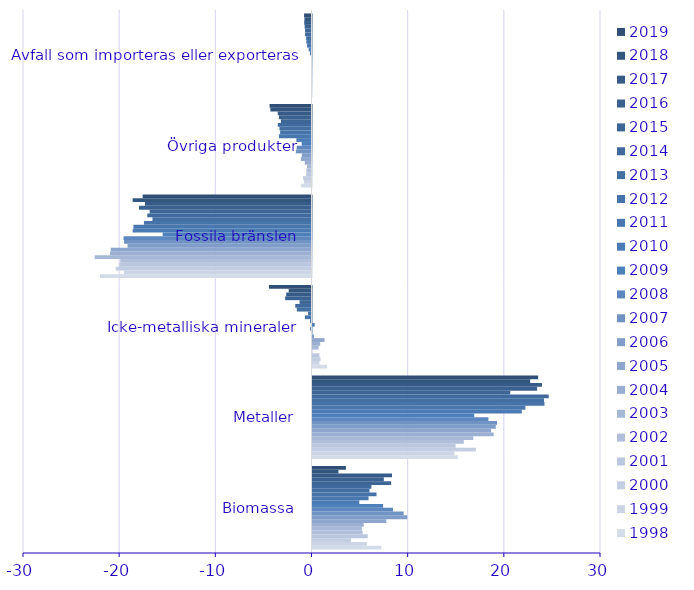
| Category | 1998 | 1999 | 2000 | 2001 | 2002 | 2003 | 2004 | 2005 | 2006 | 2007 | 2008 | 2009 | 2010 | 2011 | 2012 | 2013 | 2014 | 2015 | 2016 | 2017 | 2018 | 2019 |
|---|---|---|---|---|---|---|---|---|---|---|---|---|---|---|---|---|---|---|---|---|---|---|
| Biomassa | 7.155 | 5.646 | 4.006 | 5.745 | 5.214 | 5.129 | 5.324 | 7.68 | 9.854 | 9.479 | 8.37 | 7.344 | 4.868 | 5.828 | 6.657 | 5.93 | 6.124 | 8.178 | 7.418 | 8.266 | 2.696 | 3.474 |
| Metaller | 15.11 | 14.74 | 16.983 | 14.88 | 15.735 | 16.716 | 18.835 | 18.572 | 19.062 | 19.19 | 18.291 | 16.819 | 21.769 | 22.139 | 24.122 | 24.076 | 24.563 | 20.564 | 23.355 | 23.862 | 22.633 | 23.466 |
| Icke-metalliska mineraler | 1.521 | 0.726 | 0.835 | 0.719 | -0.034 | 0.636 | 0.795 | 1.249 | 0.15 | 0.005 | -0.148 | 0.223 | -0.152 | -0.679 | -0.36 | -1.529 | -1.692 | -1.239 | -2.738 | -2.63 | -2.375 | -4.426 |
| Fossila bränslen | -21.988 | -19.506 | -20.354 | -19.978 | -19.893 | -22.552 | -20.945 | -20.876 | -19.131 | -19.5 | -19.543 | -15.474 | -18.591 | -18.518 | -17.422 | -16.543 | -17.077 | -16.83 | -17.935 | -17.319 | -18.599 | -17.559 |
| Övriga produkter | -1.083 | -0.784 | -0.882 | -0.553 | -0.531 | -0.472 | -0.702 | -1.108 | -1.006 | -1.629 | -1.537 | -1.024 | -1.573 | -3.384 | -3.263 | -3.334 | -3.507 | -3.187 | -3.379 | -3.511 | -4.279 | -4.357 |
| Avfall som importeras eller exporteras | 0 | 0 | 0 | 0 | -0.002 | -0.002 | -0.002 | -0.017 | -0.008 | -0.013 | -0.027 | -0.156 | -0.29 | -0.46 | -0.534 | -0.56 | -0.667 | -0.671 | -0.712 | -0.756 | -0.736 | -0.773 |